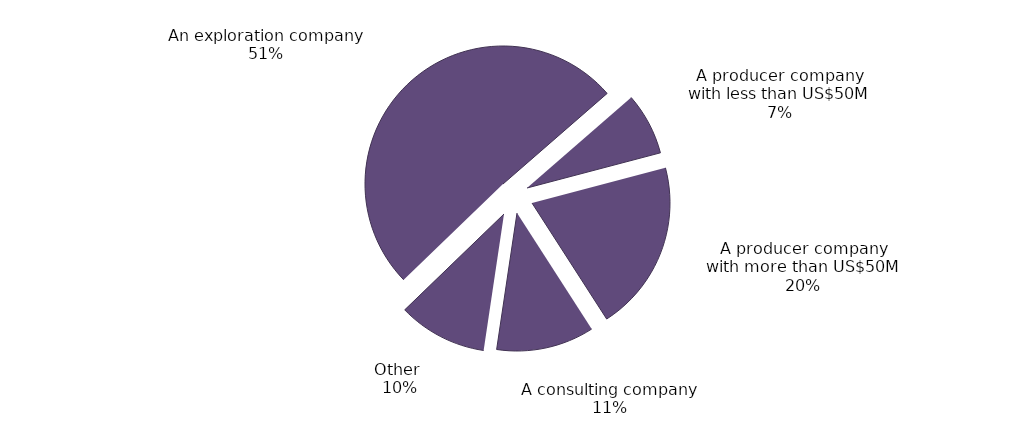
| Category | Series 0 |
|---|---|
| An exploration company | 0.508 |
| A producer company with less than US$50M | 0.073 |
| A producer company with more than US$50M | 0.2 |
| A consulting company | 0.115 |
| Other  | 0.104 |